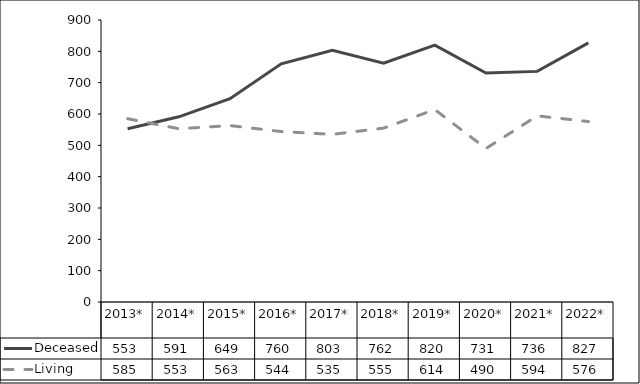
| Category | Deceased | Living |
|---|---|---|
| 2013* | 553 | 585 |
| 2014* | 591 | 553 |
| 2015* | 649 | 563 |
| 2016* | 760 | 544 |
| 2017* | 803 | 535 |
| 2018* | 762 | 555 |
| 2019* | 820 | 614 |
| 2020* | 731 | 490 |
| 2021* | 736 | 594 |
| 2022* | 827 | 576 |